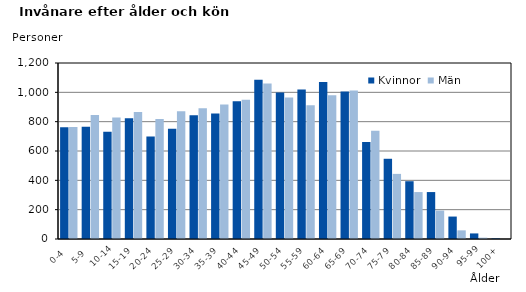
| Category | Kvinnor | Män |
|---|---|---|
|   0-4  | 762 | 763 |
|   5-9  | 765 | 846 |
| 10-14 | 731 | 829 |
| 15-19  | 823 | 866 |
| 20-24  | 699 | 819 |
| 25-29  | 752 | 871 |
| 30-34  | 844 | 892 |
| 35-39  | 855 | 917 |
| 40-44  | 940 | 950 |
| 45-49  | 1086 | 1061 |
| 50-54  | 999 | 965 |
| 55-59  | 1019 | 912 |
| 60-64  | 1071 | 980 |
| 65-69  | 1005 | 1012 |
| 70-74  | 662 | 738 |
| 75-79  | 547 | 444 |
| 80-84  | 394 | 320 |
| 85-89  | 320 | 194 |
| 90-94  | 153 | 59 |
| 95-99 | 38 | 9 |
| 100+ | 4 | 0 |